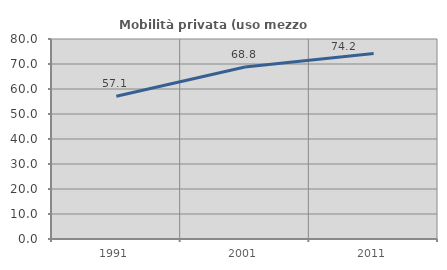
| Category | Mobilità privata (uso mezzo privato) |
|---|---|
| 1991.0 | 57.072 |
| 2001.0 | 68.822 |
| 2011.0 | 74.213 |